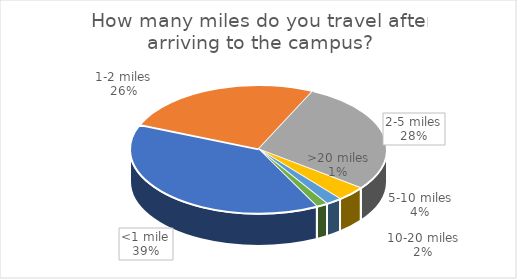
| Category | Series 0 | Series 1 |
|---|---|---|
| <1 mile | 135 | 0.387 |
| 1-2 miles | 90 | 0.258 |
| 2-5 miles | 99 | 0.284 |
| 5-10 miles | 13 | 0.037 |
| 10-20 miles | 7 | 0.02 |
| >20 miles | 5 | 0.014 |